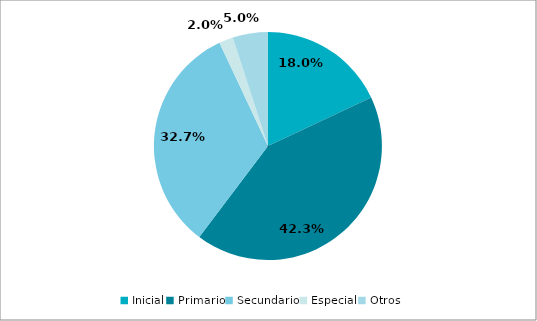
| Category | Absoluto |
|---|---|
| Inicial | 0.18 |
| Primario | 0.423 |
| Secundario | 0.327 |
| Especial | 0.02 |
| Otros | 0.05 |